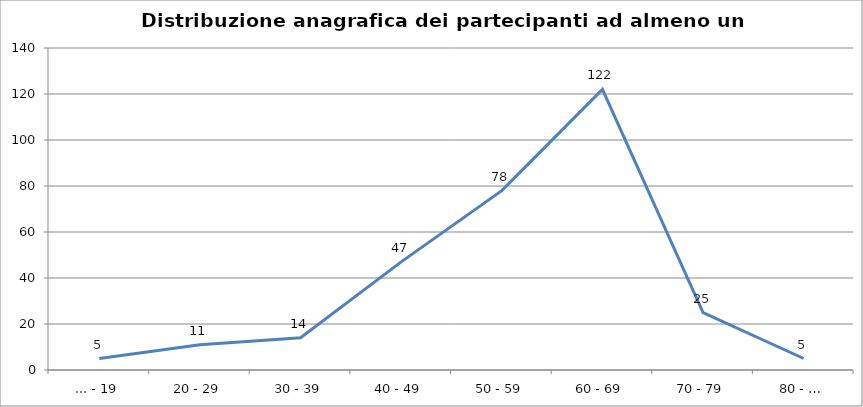
| Category | Nr. Tesserati |
|---|---|
| ... - 19 | 5 |
| 20 - 29 | 11 |
| 30 - 39 | 14 |
| 40 - 49 | 47 |
| 50 - 59 | 78 |
| 60 - 69 | 122 |
| 70 - 79 | 25 |
| 80 - … | 5 |